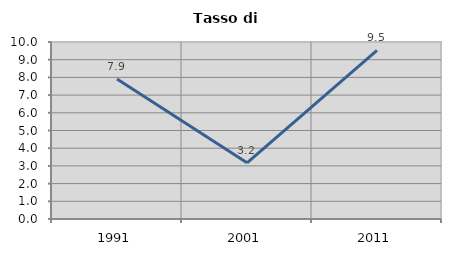
| Category | Tasso di disoccupazione   |
|---|---|
| 1991.0 | 7.905 |
| 2001.0 | 3.175 |
| 2011.0 | 9.524 |